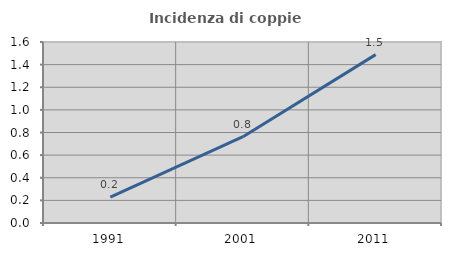
| Category | Incidenza di coppie miste |
|---|---|
| 1991.0 | 0.23 |
| 2001.0 | 0.763 |
| 2011.0 | 1.488 |